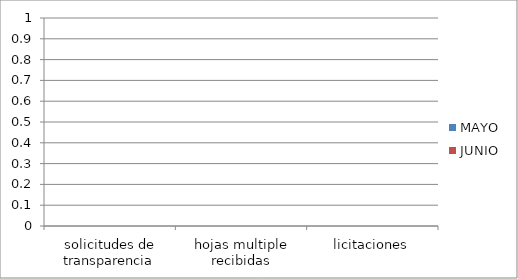
| Category | MAYO | JUNIO |
|---|---|---|
| solicitudes de transparencia | 0 | 0 |
| hojas multiple recibidas | 0 | 0 |
| licitaciones | 0 | 0 |